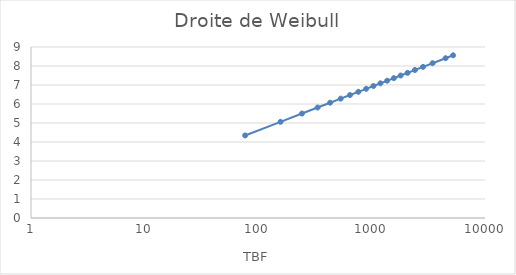
| Category | ln(TBF - Gamma) |
|---|---|
| 77.0 | 4.344 |
| 158.0 | 5.063 |
| 244.0 | 5.497 |
| 335.0 | 5.814 |
| 432.0 | 6.068 |
| 535.0 | 6.282 |
| 646.0 | 6.471 |
| 766.0 | 6.641 |
| 897.0 | 6.799 |
| 1040.0 | 6.947 |
| 1198.0 | 7.088 |
| 1374.0 | 7.225 |
| 1574.0 | 7.361 |
| 1806.0 | 7.499 |
| 2079.0 | 7.64 |
| 2414.0 | 7.789 |
| 2846.0 | 7.954 |
| 3454.0 | 8.147 |
| 4494.0 | 8.41 |
| 5236.0 | 8.563 |
| nan | 0 |
| nan | 0 |
| nan | 0 |
| nan | 0 |
| nan | 0 |
| nan | 0 |
| nan | 0 |
| nan | 0 |
| nan | 0 |
| nan | 0 |
| nan | 0 |
| nan | 0 |
| nan | 0 |
| nan | 0 |
| nan | 0 |
| nan | 0 |
| nan | 0 |
| nan | 0 |
| nan | 0 |
| nan | 0 |
| nan | 0 |
| nan | 0 |
| nan | 0 |
| nan | 0 |
| nan | 0 |
| nan | 0 |
| nan | 0 |
| nan | 0 |
| nan | 0 |
| nan | 0 |
| nan | 0 |
| nan | 0 |
| nan | 0 |
| nan | 0 |
| nan | 0 |
| nan | 0 |
| nan | 0 |
| nan | 0 |
| nan | 0 |
| nan | 0 |
| nan | 0 |
| nan | 0 |
| nan | 0 |
| nan | 0 |
| nan | 0 |
| nan | 0 |
| nan | 0 |
| nan | 0 |
| nan | 0 |
| nan | 0 |
| nan | 0 |
| nan | 0 |
| nan | 0 |
| nan | 0 |
| nan | 0 |
| nan | 0 |
| nan | 0 |
| nan | 0 |
| nan | 0 |
| nan | 0 |
| nan | 0 |
| nan | 0 |
| nan | 0 |
| nan | 0 |
| nan | 0 |
| nan | 0 |
| nan | 0 |
| nan | 0 |
| nan | 0 |
| nan | 0 |
| nan | 0 |
| nan | 0 |
| nan | 0 |
| nan | 0 |
| nan | 0 |
| nan | 0 |
| nan | 0 |
| nan | 0 |
| nan | 0 |
| nan | 0 |